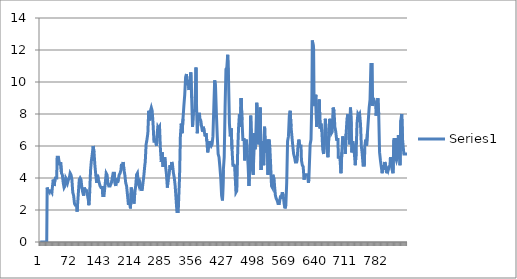
| Category | Series 0 |
|---|---|
| 0 | 0 |
| 1 | 0 |
| 2 | 0 |
| 3 | 0 |
| 4 | 0 |
| 5 | 0 |
| 6 | 0 |
| 7 | 0 |
| 8 | 0 |
| 9 | 0 |
| 10 | 0 |
| 11 | 0 |
| 12 | 0 |
| 13 | 0 |
| 14 | 0 |
| 15 | 0 |
| 16 | 3.4 |
| 17 | 3.4 |
| 18 | 3.2 |
| 19 | 3.2 |
| 20 | 3.2 |
| 21 | 3.1 |
| 22 | 3.2 |
| 23 | 3.2 |
| 24 | 3.2 |
| 25 | 3.2 |
| 26 | 3.2 |
| 27 | 3.1 |
| 28 | 3.4 |
| 29 | 3.4 |
| 30 | 3.9 |
| 31 | 3.9 |
| 32 | 3.5 |
| 33 | 3.5 |
| 34 | 3.9 |
| 35 | 4 |
| 36 | 4 |
| 37 | 4 |
| 38 | 4 |
| 39 | 5.3 |
| 40 | 5.3 |
| 41 | 5.3 |
| 42 | 5.3 |
| 43 | 5.1 |
| 44 | 5.1 |
| 45 | 4.8 |
| 46 | 4.8 |
| 47 | 5 |
| 48 | 5 |
| 49 | 4.3 |
| 50 | 4.3 |
| 51 | 4.2 |
| 52 | 4.2 |
| 53 | 3.7 |
| 54 | 3.7 |
| 55 | 3.4 |
| 56 | 3.4 |
| 57 | 3.5 |
| 58 | 3.5 |
| 59 | 4 |
| 60 | 4 |
| 61 | 3.9 |
| 62 | 3.9 |
| 63 | 3.7 |
| 64 | 3.7 |
| 65 | 3.9 |
| 66 | 3.9 |
| 67 | 4 |
| 68 | 4 |
| 69 | 4.3 |
| 70 | 4.3 |
| 71 | 4.2 |
| 72 | 4.2 |
| 73 | 3.9 |
| 74 | 3.9 |
| 75 | 3.1 |
| 76 | 3.1 |
| 77 | 2.9 |
| 78 | 2.9 |
| 79 | 2.4 |
| 80 | 2.4 |
| 81 | 2.3 |
| 82 | 2.3 |
| 83 | 2.3 |
| 84 | 2.3 |
| 85 | 1.9 |
| 86 | 2.3 |
| 87 | 2.3 |
| 88 | 3.1 |
| 89 | 3.1 |
| 90 | 3.9 |
| 91 | 3.9 |
| 92 | 4 |
| 93 | 4 |
| 94 | 3.9 |
| 95 | 3.9 |
| 96 | 3.4 |
| 97 | 3.4 |
| 98 | 3.1 |
| 99 | 3.1 |
| 100 | 2.9 |
| 101 | 2.9 |
| 102 | 3.4 |
| 103 | 3.4 |
| 104 | 3.2 |
| 105 | 3.2 |
| 106 | 3.2 |
| 107 | 3.2 |
| 108 | 3.2 |
| 109 | 2.9 |
| 110 | 2.9 |
| 111 | 2.6 |
| 112 | 2.3 |
| 113 | 2.3 |
| 114 | 3.1 |
| 115 | 3.1 |
| 116 | 4.5 |
| 117 | 4.5 |
| 118 | 5.1 |
| 119 | 5.1 |
| 120 | 5.5 |
| 121 | 5.5 |
| 122 | 6 |
| 123 | 6 |
| 124 | 5.6 |
| 125 | 5.6 |
| 126 | 4.8 |
| 127 | 4.8 |
| 128 | 4.2 |
| 129 | 4.2 |
| 130 | 3.7 |
| 131 | 3.7 |
| 132 | 4.2 |
| 133 | 4.2 |
| 134 | 3.9 |
| 135 | 3.9 |
| 136 | 3.7 |
| 137 | 3.7 |
| 138 | 3.5 |
| 139 | 3.5 |
| 140 | 3.4 |
| 141 | 3.4 |
| 142 | 3.4 |
| 143 | 3.4 |
| 144 | 2.9 |
| 145 | 2.9 |
| 146 | 2.9 |
| 147 | 2.9 |
| 148 | 2.9 |
| 149 | 2.9 |
| 150 | 3.7 |
| 151 | 3.7 |
| 152 | 4.3 |
| 153 | 4.3 |
| 154 | 4.2 |
| 155 | 4.2 |
| 156 | 3.7 |
| 157 | 3.7 |
| 158 | 3.5 |
| 159 | 3.5 |
| 160 | 3.5 |
| 161 | 3.5 |
| 162 | 3.5 |
| 163 | 3.5 |
| 164 | 3.7 |
| 165 | 3.7 |
| 166 | 4 |
| 167 | 4 |
| 168 | 4.3 |
| 169 | 4.3 |
| 170 | 4.3 |
| 171 | 4.3 |
| 172 | 3.7 |
| 173 | 3.7 |
| 174 | 3.5 |
| 175 | 3.5 |
| 176 | 4 |
| 177 | 4 |
| 178 | 3.7 |
| 179 | 3.7 |
| 180 | 3.9 |
| 181 | 3.9 |
| 182 | 4.2 |
| 183 | 4.2 |
| 184 | 4.3 |
| 185 | 4.3 |
| 186 | 4.5 |
| 187 | 4.8 |
| 188 | 4.8 |
| 189 | 4.8 |
| 190 | 4.8 |
| 191 | 5 |
| 192 | 5 |
| 193 | 4.5 |
| 194 | 4.5 |
| 195 | 4.2 |
| 196 | 4.2 |
| 197 | 3.7 |
| 198 | 3.7 |
| 199 | 3.5 |
| 200 | 3.5 |
| 201 | 3.5 |
| 202 | 2.7 |
| 203 | 2.4 |
| 204 | 2.4 |
| 205 | 2.4 |
| 206 | 2.4 |
| 207 | 2.4 |
| 208 | 2.1 |
| 209 | 2.1 |
| 210 | 3.4 |
| 211 | 3.4 |
| 212 | 3.1 |
| 213 | 3.1 |
| 214 | 2.7 |
| 215 | 2.7 |
| 216 | 2.4 |
| 217 | 2.4 |
| 218 | 3.1 |
| 219 | 3.1 |
| 220 | 3.5 |
| 221 | 3.5 |
| 222 | 4.2 |
| 223 | 4.2 |
| 224 | 4.3 |
| 225 | 4.3 |
| 226 | 3.7 |
| 227 | 3.7 |
| 228 | 3.5 |
| 229 | 3.5 |
| 230 | 3.7 |
| 231 | 3.7 |
| 232 | 3.5 |
| 233 | 3.5 |
| 234 | 3.2 |
| 235 | 3.2 |
| 236 | 3.5 |
| 237 | 3.5 |
| 238 | 3.5 |
| 239 | 4.2 |
| 240 | 4.2 |
| 241 | 4.8 |
| 242 | 5 |
| 243 | 5 |
| 244 | 6.1 |
| 245 | 6.1 |
| 246 | 6.4 |
| 247 | 6.4 |
| 248 | 6.8 |
| 249 | 6.8 |
| 250 | 8.2 |
| 251 | 8.2 |
| 252 | 7.6 |
| 253 | 7.6 |
| 254 | 8.2 |
| 255 | 8.2 |
| 256 | 8.4 |
| 257 | 8.4 |
| 258 | 8.2 |
| 259 | 8.2 |
| 260 | 7.4 |
| 261 | 7.4 |
| 262 | 6.3 |
| 263 | 6.3 |
| 264 | 6.3 |
| 265 | 6.3 |
| 266 | 6.4 |
| 267 | 6.4 |
| 268 | 6 |
| 269 | 6.6 |
| 270 | 6.6 |
| 271 | 7.2 |
| 272 | 7.2 |
| 273 | 7.1 |
| 274 | 7.1 |
| 275 | 7.2 |
| 276 | 7.2 |
| 277 | 5.8 |
| 278 | 5.8 |
| 279 | 5 |
| 280 | 5 |
| 281 | 5.6 |
| 282 | 5.6 |
| 283 | 4.7 |
| 284 | 4.7 |
| 285 | 5 |
| 286 | 5 |
| 287 | 5.3 |
| 288 | 5.3 |
| 289 | 4.7 |
| 290 | 4.7 |
| 291 | 4.2 |
| 292 | 4.2 |
| 293 | 3.4 |
| 294 | 3.4 |
| 295 | 4 |
| 296 | 4 |
| 297 | 4.2 |
| 298 | 4.2 |
| 299 | 4.8 |
| 300 | 4.8 |
| 301 | 4.5 |
| 302 | 4.5 |
| 303 | 5 |
| 304 | 5 |
| 305 | 4.8 |
| 306 | 4.8 |
| 307 | 4.3 |
| 308 | 4.3 |
| 309 | 4 |
| 310 | 4 |
| 311 | 3.5 |
| 312 | 3.5 |
| 313 | 2.7 |
| 314 | 2.7 |
| 315 | 1.9 |
| 316 | 1.9 |
| 317 | 1.9 |
| 318 | 1.9 |
| 319 | 2.6 |
| 320 | 2.6 |
| 321 | 4 |
| 322 | 4 |
| 323 | 6.6 |
| 324 | 6.6 |
| 325 | 7.4 |
| 326 | 7.4 |
| 327 | 6.8 |
| 328 | 6.8 |
| 329 | 7.7 |
| 330 | 7.7 |
| 331 | 8.5 |
| 332 | 8.5 |
| 333 | 9.2 |
| 334 | 9.2 |
| 335 | 10.3 |
| 336 | 10.3 |
| 337 | 10.5 |
| 338 | 10.5 |
| 339 | 9.8 |
| 340 | 9.8 |
| 341 | 10.1 |
| 342 | 10.1 |
| 343 | 9.5 |
| 344 | 9.5 |
| 345 | 10 |
| 346 | 10 |
| 347 | 10.6 |
| 348 | 10.6 |
| 349 | 9 |
| 350 | 9 |
| 351 | 7.2 |
| 352 | 7.2 |
| 353 | 8.2 |
| 354 | 8.2 |
| 355 | 8.2 |
| 356 | 8.2 |
| 357 | 8.9 |
| 358 | 8.9 |
| 359 | 10.9 |
| 360 | 8.7 |
| 361 | 8.7 |
| 362 | 6.8 |
| 363 | 6.8 |
| 364 | 8 |
| 365 | 8 |
| 366 | 8 |
| 367 | 8 |
| 368 | 7.7 |
| 369 | 7.7 |
| 370 | 7.6 |
| 371 | 7.6 |
| 372 | 7.2 |
| 373 | 7.2 |
| 374 | 6.9 |
| 375 | 6.9 |
| 376 | 7.2 |
| 377 | 7.2 |
| 378 | 6.9 |
| 379 | 6.9 |
| 380 | 6.6 |
| 381 | 6.6 |
| 382 | 6.8 |
| 383 | 6.8 |
| 384 | 6.3 |
| 385 | 6.3 |
| 386 | 5.6 |
| 387 | 5.6 |
| 388 | 6 |
| 389 | 6 |
| 390 | 6.3 |
| 391 | 6.3 |
| 392 | 6.1 |
| 393 | 6.1 |
| 394 | 6 |
| 395 | 6 |
| 396 | 6.1 |
| 397 | 6.1 |
| 398 | 6.6 |
| 399 | 6.6 |
| 400 | 8.4 |
| 401 | 8.4 |
| 402 | 10.1 |
| 403 | 10.1 |
| 404 | 9.7 |
| 405 | 9.7 |
| 406 | 8 |
| 407 | 8 |
| 408 | 6.6 |
| 409 | 6.6 |
| 410 | 5.5 |
| 411 | 5.5 |
| 412 | 5.3 |
| 413 | 5.3 |
| 414 | 4.7 |
| 415 | 4.7 |
| 416 | 4 |
| 417 | 4 |
| 418 | 2.9 |
| 419 | 2.9 |
| 420 | 2.6 |
| 421 | 2.6 |
| 422 | 4.5 |
| 423 | 4.5 |
| 424 | 5.3 |
| 425 | 5.3 |
| 426 | 8.4 |
| 427 | 8.4 |
| 428 | 10.8 |
| 429 | 10.8 |
| 430 | 10.9 |
| 431 | 10.9 |
| 432 | 11.7 |
| 433 | 11.7 |
| 434 | 10.1 |
| 435 | 10.1 |
| 436 | 7.4 |
| 437 | 7.4 |
| 438 | 6.6 |
| 439 | 6.6 |
| 440 | 7.1 |
| 441 | 7.1 |
| 442 | 5.8 |
| 443 | 5.8 |
| 444 | 4.8 |
| 445 | 4.8 |
| 446 | 4.8 |
| 447 | 4.8 |
| 448 | 4.7 |
| 449 | 4.7 |
| 450 | 3.7 |
| 451 | 3.1 |
| 452 | 3.1 |
| 453 | 3.2 |
| 454 | 3.2 |
| 455 | 5.6 |
| 456 | 5.6 |
| 457 | 7.1 |
| 458 | 7.1 |
| 459 | 8 |
| 460 | 8 |
| 461 | 7.2 |
| 462 | 7.2 |
| 463 | 9 |
| 464 | 9 |
| 465 | 7.6 |
| 466 | 7.6 |
| 467 | 6.4 |
| 468 | 6.4 |
| 469 | 6.4 |
| 470 | 6.4 |
| 471 | 5.1 |
| 472 | 5.1 |
| 473 | 6 |
| 474 | 6 |
| 475 | 6.4 |
| 476 | 6.4 |
| 477 | 5.6 |
| 478 | 5.6 |
| 479 | 4.8 |
| 480 | 4.8 |
| 481 | 3.5 |
| 482 | 3.5 |
| 483 | 5 |
| 484 | 5 |
| 485 | 7.9 |
| 486 | 7.9 |
| 487 | 6.3 |
| 488 | 6.3 |
| 489 | 4.5 |
| 490 | 4.5 |
| 491 | 4.2 |
| 492 | 4.2 |
| 493 | 6.8 |
| 494 | 6.8 |
| 495 | 5.8 |
| 496 | 5.8 |
| 497 | 6.8 |
| 498 | 6.8 |
| 499 | 8.7 |
| 500 | 8.7 |
| 501 | 7.6 |
| 502 | 7.6 |
| 503 | 6.1 |
| 504 | 6.1 |
| 505 | 6.1 |
| 506 | 7.1 |
| 507 | 8.4 |
| 508 | 8.4 |
| 509 | 4.5 |
| 510 | 4.5 |
| 511 | 6.3 |
| 512 | 6.3 |
| 513 | 5.8 |
| 514 | 5.8 |
| 515 | 4.8 |
| 516 | 4.8 |
| 517 | 7.2 |
| 518 | 7.2 |
| 519 | 5.6 |
| 520 | 5.6 |
| 521 | 6.1 |
| 522 | 6.1 |
| 523 | 6.4 |
| 524 | 6.4 |
| 525 | 4.2 |
| 526 | 4.2 |
| 527 | 6.4 |
| 528 | 6.4 |
| 529 | 6 |
| 530 | 6 |
| 531 | 4.8 |
| 532 | 4.8 |
| 533 | 3.5 |
| 534 | 3.5 |
| 535 | 3.4 |
| 536 | 4.2 |
| 537 | 4.2 |
| 538 | 4.2 |
| 539 | 3.9 |
| 540 | 3.5 |
| 541 | 3.5 |
| 542 | 2.9 |
| 543 | 2.9 |
| 544 | 2.7 |
| 545 | 2.7 |
| 546 | 2.6 |
| 547 | 2.6 |
| 548 | 2.4 |
| 549 | 2.4 |
| 550 | 2.4 |
| 551 | 2.4 |
| 552 | 2.6 |
| 553 | 2.6 |
| 554 | 2.9 |
| 555 | 2.9 |
| 556 | 2.7 |
| 557 | 2.7 |
| 558 | 3.1 |
| 559 | 3.1 |
| 560 | 2.9 |
| 561 | 2.9 |
| 562 | 2.4 |
| 563 | 2.4 |
| 564 | 2.1 |
| 565 | 2.1 |
| 566 | 2.3 |
| 567 | 2.3 |
| 568 | 3.7 |
| 569 | 3.7 |
| 570 | 6.3 |
| 571 | 6.3 |
| 572 | 6.6 |
| 573 | 6.6 |
| 574 | 7.9 |
| 575 | 7.9 |
| 576 | 8.2 |
| 577 | 8.2 |
| 578 | 7.2 |
| 579 | 7.2 |
| 580 | 6.6 |
| 581 | 6.6 |
| 582 | 6 |
| 583 | 6 |
| 584 | 5.5 |
| 585 | 5.5 |
| 586 | 5.3 |
| 587 | 5.3 |
| 588 | 5 |
| 589 | 5 |
| 590 | 5 |
| 591 | 5 |
| 592 | 5.1 |
| 593 | 5.1 |
| 594 | 6 |
| 595 | 6 |
| 596 | 6.4 |
| 597 | 6.4 |
| 598 | 6 |
| 599 | 6 |
| 600 | 6 |
| 601 | 6 |
| 602 | 5.1 |
| 603 | 5.1 |
| 604 | 4.8 |
| 605 | 4.8 |
| 606 | 4.7 |
| 607 | 4.7 |
| 608 | 3.9 |
| 609 | 3.9 |
| 610 | 4.2 |
| 611 | 4.2 |
| 612 | 4.2 |
| 613 | 4.2 |
| 614 | 4.2 |
| 615 | 4.2 |
| 616 | 4.2 |
| 617 | 4.2 |
| 618 | 3.7 |
| 619 | 3.9 |
| 620 | 3.9 |
| 621 | 3.9 |
| 622 | 6.1 |
| 623 | 6.1 |
| 624 | 6.4 |
| 625 | 6.4 |
| 626 | 9 |
| 627 | 12.6 |
| 628 | 12.6 |
| 629 | 12.6 |
| 630 | 12.1 |
| 631 | 8.7 |
| 632 | 8.7 |
| 633 | 8.5 |
| 634 | 8.5 |
| 635 | 9.2 |
| 636 | 9.2 |
| 637 | 7.2 |
| 638 | 7.2 |
| 639 | 7.6 |
| 640 | 7.6 |
| 641 | 7.4 |
| 642 | 7.4 |
| 643 | 8.9 |
| 644 | 8.9 |
| 645 | 7.1 |
| 646 | 7.1 |
| 647 | 7.4 |
| 648 | 7.4 |
| 649 | 6.9 |
| 650 | 6.9 |
| 651 | 5.8 |
| 652 | 5.8 |
| 653 | 5.5 |
| 654 | 5.5 |
| 655 | 6.4 |
| 656 | 6.4 |
| 657 | 7.7 |
| 658 | 7.7 |
| 659 | 6.8 |
| 660 | 6.8 |
| 661 | 5.8 |
| 662 | 5.8 |
| 663 | 5.3 |
| 664 | 5.3 |
| 665 | 6.6 |
| 666 | 6.6 |
| 667 | 7.7 |
| 668 | 7.7 |
| 669 | 7.2 |
| 670 | 7.2 |
| 671 | 6.8 |
| 672 | 6.8 |
| 673 | 6.9 |
| 674 | 6.9 |
| 675 | 8.4 |
| 676 | 8.4 |
| 677 | 8.2 |
| 678 | 8.2 |
| 679 | 7.2 |
| 680 | 7.2 |
| 681 | 6.9 |
| 682 | 6.9 |
| 683 | 6.4 |
| 684 | 6.4 |
| 685 | 6.4 |
| 686 | 6.4 |
| 687 | 5.3 |
| 688 | 5.3 |
| 689 | 5.3 |
| 690 | 5.3 |
| 691 | 5.1 |
| 692 | 5.1 |
| 693 | 4.3 |
| 694 | 4.3 |
| 695 | 5.6 |
| 696 | 5.6 |
| 697 | 6.6 |
| 698 | 6.6 |
| 699 | 6.3 |
| 700 | 6.3 |
| 701 | 6.1 |
| 702 | 6.1 |
| 703 | 5.5 |
| 704 | 5.5 |
| 705 | 6.8 |
| 706 | 6.8 |
| 707 | 7.7 |
| 708 | 7.7 |
| 709 | 8 |
| 710 | 8 |
| 711 | 7.4 |
| 712 | 7.4 |
| 713 | 6.1 |
| 714 | 6.1 |
| 715 | 8.4 |
| 716 | 8.4 |
| 717 | 7.2 |
| 718 | 5.6 |
| 719 | 5.6 |
| 720 | 6.3 |
| 721 | 6.3 |
| 722 | 6 |
| 723 | 6 |
| 724 | 5.5 |
| 725 | 5.5 |
| 726 | 4.8 |
| 727 | 4.8 |
| 728 | 5.6 |
| 729 | 5.6 |
| 730 | 7.4 |
| 731 | 7.4 |
| 732 | 8 |
| 733 | 8 |
| 734 | 7.9 |
| 735 | 7.9 |
| 736 | 8 |
| 737 | 8 |
| 738 | 7.4 |
| 739 | 7.4 |
| 740 | 6 |
| 741 | 6 |
| 742 | 5.5 |
| 743 | 5.5 |
| 744 | 4.8 |
| 745 | 4.8 |
| 746 | 4.8 |
| 747 | 4.8 |
| 748 | 6 |
| 749 | 6 |
| 750 | 6.4 |
| 751 | 6.4 |
| 752 | 6 |
| 753 | 6 |
| 754 | 6.8 |
| 755 | 6.8 |
| 756 | 7.6 |
| 757 | 7.6 |
| 758 | 8.4 |
| 759 | 8.4 |
| 760 | 8.9 |
| 761 | 8.9 |
| 762 | 11.1 |
| 763 | 11.1 |
| 764 | 11.1 |
| 765 | 11.1 |
| 766 | 8.5 |
| 767 | 8.5 |
| 768 | 9 |
| 769 | 9 |
| 770 | 8.7 |
| 771 | 8.7 |
| 772 | 8.7 |
| 773 | 8.7 |
| 774 | 7.9 |
| 775 | 7.9 |
| 776 | 8.4 |
| 777 | 8.4 |
| 778 | 9 |
| 779 | 9 |
| 780 | 8 |
| 781 | 8 |
| 782 | 5.6 |
| 783 | 5.6 |
| 784 | 5.1 |
| 785 | 5.1 |
| 786 | 4.7 |
| 787 | 4.7 |
| 788 | 4.3 |
| 789 | 4.3 |
| 790 | 4.8 |
| 791 | 4.8 |
| 792 | 4.5 |
| 793 | 4.5 |
| 794 | 5 |
| 795 | 5 |
| 796 | 4.8 |
| 797 | 4.8 |
| 798 | 4.3 |
| 799 | 4.3 |
| 800 | 4.7 |
| 801 | 4.7 |
| 802 | 4.5 |
| 803 | 4.5 |
| 804 | 4.7 |
| 805 | 4.7 |
| 806 | 4.8 |
| 807 | 5.3 |
| 808 | 5.3 |
| 809 | 4.8 |
| 810 | 4.8 |
| 811 | 4.5 |
| 812 | 4.5 |
| 813 | 4.3 |
| 814 | 4.3 |
| 815 | 6.4 |
| 816 | 6.4 |
| 817 | 6.4 |
| 818 | 6.4 |
| 819 | 5.3 |
| 820 | 5.3 |
| 821 | 5.1 |
| 822 | 5.1 |
| 823 | 5.3 |
| 824 | 5.3 |
| 825 | 6.6 |
| 826 | 6.6 |
| 827 | 6.6 |
| 828 | 6.6 |
| 829 | 4.8 |
| 830 | 4.8 |
| 831 | 7.6 |
| 832 | 7.6 |
| 833 | 8 |
| 834 | 8 |
| 835 | 6.4 |
| 836 | 6.4 |
| 837 | 6.4 |
| 838 | 5.5 |
| 839 | 5.5 |
| 840 | 5.5 |
| 841 | 5.5 |
| 842 | 5.5 |
| 843 | 5.5 |
| 844 | 5.5 |
| 845 | 5.5 |
| 846 | 5.5 |
| 847 | 5.5 |